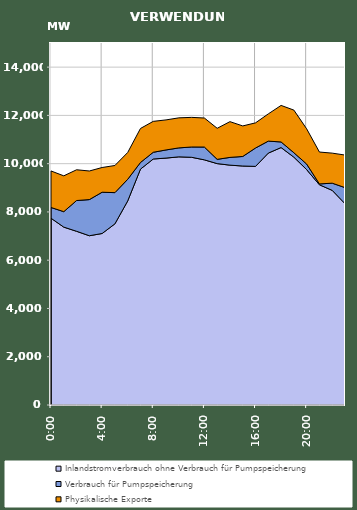
| Category | Inlandstromverbrauch ohne Verbrauch für Pumpspeicherung | Verbrauch für Pumpspeicherung | Physikalische Exporte |
|---|---|---|---|
| 2007-01-17 | 7740.015 | 444.901 | 1512.731 |
| 2007-01-17 01:00:00 | 7370.66 | 640.417 | 1484.891 |
| 2007-01-17 02:00:00 | 7198.133 | 1273.993 | 1274.806 |
| 2007-01-17 03:00:00 | 7013.462 | 1497.585 | 1185.724 |
| 2007-01-17 04:00:00 | 7106.828 | 1709.976 | 1024.124 |
| 2007-01-17 05:00:00 | 7506.339 | 1293.614 | 1124.231 |
| 2007-01-17 06:00:00 | 8454.434 | 897.251 | 1111.602 |
| 2007-01-17 07:00:00 | 9773.428 | 275.329 | 1410.263 |
| 2007-01-17 08:00:00 | 10193.067 | 279.321 | 1280.562 |
| 2007-01-17 09:00:00 | 10231.149 | 337.424 | 1245.334 |
| 2007-01-17 10:00:00 | 10282.285 | 371.401 | 1244.968 |
| 2007-01-17 11:00:00 | 10264.042 | 426.905 | 1227.536 |
| 2007-01-17 12:00:00 | 10158.394 | 530.616 | 1202.438 |
| 2007-01-17 13:00:00 | 10001.828 | 177.21 | 1286.829 |
| 2007-01-17 14:00:00 | 9938.842 | 320.699 | 1481.839 |
| 2007-01-17 15:00:00 | 9902.133 | 395.904 | 1265.361 |
| 2007-01-17 16:00:00 | 9886.63 | 761.919 | 1042.089 |
| 2007-01-17 17:00:00 | 10437.52 | 496.162 | 1129.19 |
| 2007-01-17 18:00:00 | 10667.671 | 232.321 | 1513.728 |
| 2007-01-17 19:00:00 | 10269.611 | 183.462 | 1766.789 |
| 2007-01-17 20:00:00 | 9753.422 | 231.97 | 1458.089 |
| 2007-01-17 21:00:00 | 9124.704 | 35.511 | 1321.908 |
| 2007-01-17 22:00:00 | 8893.73 | 297.636 | 1245.324 |
| 2007-01-17 23:00:00 | 8342.428 | 665.515 | 1348.796 |